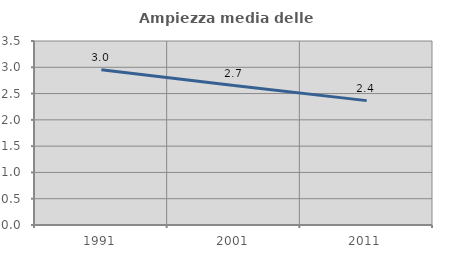
| Category | Ampiezza media delle famiglie |
|---|---|
| 1991.0 | 2.952 |
| 2001.0 | 2.653 |
| 2011.0 | 2.366 |